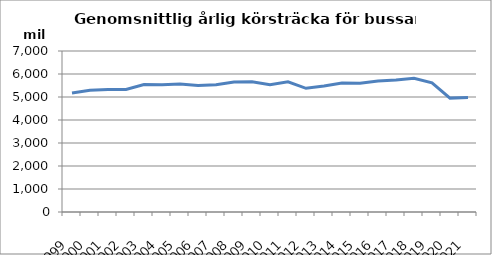
| Category | Series 0 |
|---|---|
| 1999.0 | 5178.382 |
| 2000.0 | 5296.302 |
| 2001.0 | 5324.333 |
| 2002.0 | 5326.515 |
| 2003.0 | 5542.768 |
| 2004.0 | 5537.502 |
| 2005.0 | 5561.901 |
| 2006.0 | 5504.197 |
| 2007.0 | 5534.15 |
| 2008.0 | 5655.903 |
| 2009.0 | 5663.882 |
| 2010.0 | 5535.806 |
| 2011.0 | 5658.339 |
| 2012.0 | 5376.924 |
| 2013.0 | 5474.544 |
| 2014.0 | 5603.829 |
| 2015.0 | 5599.208 |
| 2016.0 | 5696.267 |
| 2017.0 | 5737.071 |
| 2018.0 | 5816.409 |
| 2019.0 | 5612.031 |
| 2020.0 | 4951.313 |
| 2021.0 | 4973.195 |